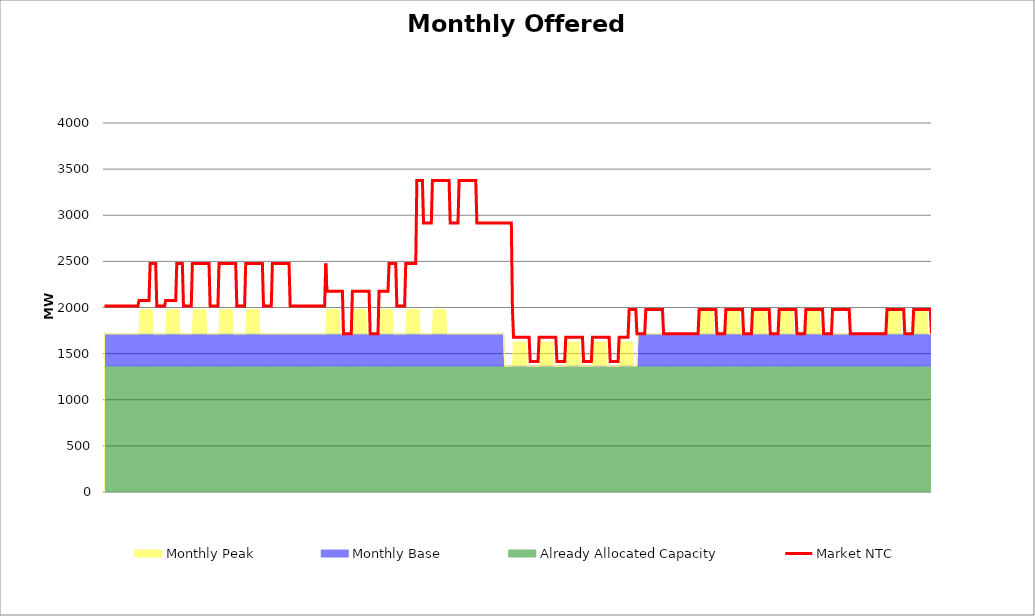
| Category | Market NTC |
|---|---|
| 0 | 2015 |
| 1 | 2015 |
| 2 | 2015 |
| 3 | 2015 |
| 4 | 2015 |
| 5 | 2015 |
| 6 | 2015 |
| 7 | 2015 |
| 8 | 2015 |
| 9 | 2015 |
| 10 | 2015 |
| 11 | 2015 |
| 12 | 2015 |
| 13 | 2015 |
| 14 | 2015 |
| 15 | 2015 |
| 16 | 2015 |
| 17 | 2015 |
| 18 | 2015 |
| 19 | 2015 |
| 20 | 2015 |
| 21 | 2015 |
| 22 | 2015 |
| 23 | 2015 |
| 24 | 2015 |
| 25 | 2015 |
| 26 | 2015 |
| 27 | 2015 |
| 28 | 2015 |
| 29 | 2015 |
| 30 | 2015 |
| 31 | 2077 |
| 32 | 2077 |
| 33 | 2077 |
| 34 | 2077 |
| 35 | 2077 |
| 36 | 2077 |
| 37 | 2077 |
| 38 | 2077 |
| 39 | 2077 |
| 40 | 2077 |
| 41 | 2477 |
| 42 | 2477 |
| 43 | 2477 |
| 44 | 2477 |
| 45 | 2477 |
| 46 | 2477 |
| 47 | 2015 |
| 48 | 2015 |
| 49 | 2015 |
| 50 | 2015 |
| 51 | 2015 |
| 52 | 2015 |
| 53 | 2015 |
| 54 | 2015 |
| 55 | 2077 |
| 56 | 2077 |
| 57 | 2077 |
| 58 | 2077 |
| 59 | 2077 |
| 60 | 2077 |
| 61 | 2077 |
| 62 | 2077 |
| 63 | 2077 |
| 64 | 2077 |
| 65 | 2477 |
| 66 | 2477 |
| 67 | 2477 |
| 68 | 2477 |
| 69 | 2477 |
| 70 | 2477 |
| 71 | 2015 |
| 72 | 2015 |
| 73 | 2015 |
| 74 | 2015 |
| 75 | 2015 |
| 76 | 2015 |
| 77 | 2015 |
| 78 | 2015 |
| 79 | 2477 |
| 80 | 2477 |
| 81 | 2477 |
| 82 | 2477 |
| 83 | 2477 |
| 84 | 2477 |
| 85 | 2477 |
| 86 | 2477 |
| 87 | 2477 |
| 88 | 2477 |
| 89 | 2477 |
| 90 | 2477 |
| 91 | 2477 |
| 92 | 2477 |
| 93 | 2477 |
| 94 | 2477 |
| 95 | 2015 |
| 96 | 2015 |
| 97 | 2015 |
| 98 | 2015 |
| 99 | 2015 |
| 100 | 2015 |
| 101 | 2015 |
| 102 | 2015 |
| 103 | 2477 |
| 104 | 2477 |
| 105 | 2477 |
| 106 | 2477 |
| 107 | 2477 |
| 108 | 2477 |
| 109 | 2477 |
| 110 | 2477 |
| 111 | 2477 |
| 112 | 2477 |
| 113 | 2477 |
| 114 | 2477 |
| 115 | 2477 |
| 116 | 2477 |
| 117 | 2477 |
| 118 | 2477 |
| 119 | 2015 |
| 120 | 2015 |
| 121 | 2015 |
| 122 | 2015 |
| 123 | 2015 |
| 124 | 2015 |
| 125 | 2015 |
| 126 | 2015 |
| 127 | 2477 |
| 128 | 2477 |
| 129 | 2477 |
| 130 | 2477 |
| 131 | 2477 |
| 132 | 2477 |
| 133 | 2477 |
| 134 | 2477 |
| 135 | 2477 |
| 136 | 2477 |
| 137 | 2477 |
| 138 | 2477 |
| 139 | 2477 |
| 140 | 2477 |
| 141 | 2477 |
| 142 | 2477 |
| 143 | 2015 |
| 144 | 2015 |
| 145 | 2015 |
| 146 | 2015 |
| 147 | 2015 |
| 148 | 2015 |
| 149 | 2015 |
| 150 | 2015 |
| 151 | 2477 |
| 152 | 2477 |
| 153 | 2477 |
| 154 | 2477 |
| 155 | 2477 |
| 156 | 2477 |
| 157 | 2477 |
| 158 | 2477 |
| 159 | 2477 |
| 160 | 2477 |
| 161 | 2477 |
| 162 | 2477 |
| 163 | 2477 |
| 164 | 2477 |
| 165 | 2477 |
| 166 | 2477 |
| 167 | 2015 |
| 168 | 2015 |
| 169 | 2015 |
| 170 | 2015 |
| 171 | 2015 |
| 172 | 2015 |
| 173 | 2015 |
| 174 | 2015 |
| 175 | 2015 |
| 176 | 2015 |
| 177 | 2015 |
| 178 | 2015 |
| 179 | 2015 |
| 180 | 2015 |
| 181 | 2015 |
| 182 | 2015 |
| 183 | 2015 |
| 184 | 2015 |
| 185 | 2015 |
| 186 | 2015 |
| 187 | 2015 |
| 188 | 2015 |
| 189 | 2015 |
| 190 | 2015 |
| 191 | 2015 |
| 192 | 2015 |
| 193 | 2015 |
| 194 | 2015 |
| 195 | 2015 |
| 196 | 2015 |
| 197 | 2015 |
| 198 | 2015 |
| 199 | 2477 |
| 200 | 2177 |
| 201 | 2177 |
| 202 | 2177 |
| 203 | 2177 |
| 204 | 2177 |
| 205 | 2177 |
| 206 | 2177 |
| 207 | 2177 |
| 208 | 2177 |
| 209 | 2177 |
| 210 | 2177 |
| 211 | 2177 |
| 212 | 2177 |
| 213 | 2177 |
| 214 | 2177 |
| 215 | 1715 |
| 216 | 1715 |
| 217 | 1715 |
| 218 | 1715 |
| 219 | 1715 |
| 220 | 1715 |
| 221 | 1715 |
| 222 | 1715 |
| 223 | 2177 |
| 224 | 2177 |
| 225 | 2177 |
| 226 | 2177 |
| 227 | 2177 |
| 228 | 2177 |
| 229 | 2177 |
| 230 | 2177 |
| 231 | 2177 |
| 232 | 2177 |
| 233 | 2177 |
| 234 | 2177 |
| 235 | 2177 |
| 236 | 2177 |
| 237 | 2177 |
| 238 | 2177 |
| 239 | 1715 |
| 240 | 1715 |
| 241 | 1715 |
| 242 | 1715 |
| 243 | 1715 |
| 244 | 1715 |
| 245 | 1715 |
| 246 | 1715 |
| 247 | 2177 |
| 248 | 2177 |
| 249 | 2177 |
| 250 | 2177 |
| 251 | 2177 |
| 252 | 2177 |
| 253 | 2177 |
| 254 | 2177 |
| 255 | 2177 |
| 256 | 2477 |
| 257 | 2477 |
| 258 | 2477 |
| 259 | 2477 |
| 260 | 2477 |
| 261 | 2477 |
| 262 | 2477 |
| 263 | 2015 |
| 264 | 2015 |
| 265 | 2015 |
| 266 | 2015 |
| 267 | 2015 |
| 268 | 2015 |
| 269 | 2015 |
| 270 | 2015 |
| 271 | 2477 |
| 272 | 2477 |
| 273 | 2477 |
| 274 | 2477 |
| 275 | 2477 |
| 276 | 2477 |
| 277 | 2477 |
| 278 | 2477 |
| 279 | 2477 |
| 280 | 2477 |
| 281 | 3377 |
| 282 | 3377 |
| 283 | 3377 |
| 284 | 3377 |
| 285 | 3377 |
| 286 | 3377 |
| 287 | 2915 |
| 288 | 2915 |
| 289 | 2915 |
| 290 | 2915 |
| 291 | 2915 |
| 292 | 2915 |
| 293 | 2915 |
| 294 | 2915 |
| 295 | 3377 |
| 296 | 3377 |
| 297 | 3377 |
| 298 | 3377 |
| 299 | 3377 |
| 300 | 3377 |
| 301 | 3377 |
| 302 | 3377 |
| 303 | 3377 |
| 304 | 3377 |
| 305 | 3377 |
| 306 | 3377 |
| 307 | 3377 |
| 308 | 3377 |
| 309 | 3377 |
| 310 | 3377 |
| 311 | 2915 |
| 312 | 2915 |
| 313 | 2915 |
| 314 | 2915 |
| 315 | 2915 |
| 316 | 2915 |
| 317 | 2915 |
| 318 | 2915 |
| 319 | 3377 |
| 320 | 3377 |
| 321 | 3377 |
| 322 | 3377 |
| 323 | 3377 |
| 324 | 3377 |
| 325 | 3377 |
| 326 | 3377 |
| 327 | 3377 |
| 328 | 3377 |
| 329 | 3377 |
| 330 | 3377 |
| 331 | 3377 |
| 332 | 3377 |
| 333 | 3377 |
| 334 | 3377 |
| 335 | 2915 |
| 336 | 2915 |
| 337 | 2915 |
| 338 | 2915 |
| 339 | 2915 |
| 340 | 2915 |
| 341 | 2915 |
| 342 | 2915 |
| 343 | 2915 |
| 344 | 2915 |
| 345 | 2915 |
| 346 | 2915 |
| 347 | 2915 |
| 348 | 2915 |
| 349 | 2915 |
| 350 | 2915 |
| 351 | 2915 |
| 352 | 2915 |
| 353 | 2915 |
| 354 | 2915 |
| 355 | 2915 |
| 356 | 2915 |
| 357 | 2915 |
| 358 | 2915 |
| 359 | 2915 |
| 360 | 2915 |
| 361 | 2915 |
| 362 | 2915 |
| 363 | 2915 |
| 364 | 2915 |
| 365 | 2915 |
| 366 | 2915 |
| 367 | 1977 |
| 368 | 1677 |
| 369 | 1677 |
| 370 | 1677 |
| 371 | 1677 |
| 372 | 1677 |
| 373 | 1677 |
| 374 | 1677 |
| 375 | 1677 |
| 376 | 1677 |
| 377 | 1677 |
| 378 | 1677 |
| 379 | 1677 |
| 380 | 1677 |
| 381 | 1677 |
| 382 | 1677 |
| 383 | 1415 |
| 384 | 1415 |
| 385 | 1415 |
| 386 | 1415 |
| 387 | 1415 |
| 388 | 1415 |
| 389 | 1415 |
| 390 | 1415 |
| 391 | 1677 |
| 392 | 1677 |
| 393 | 1677 |
| 394 | 1677 |
| 395 | 1677 |
| 396 | 1677 |
| 397 | 1677 |
| 398 | 1677 |
| 399 | 1677 |
| 400 | 1677 |
| 401 | 1677 |
| 402 | 1677 |
| 403 | 1677 |
| 404 | 1677 |
| 405 | 1677 |
| 406 | 1677 |
| 407 | 1415 |
| 408 | 1415 |
| 409 | 1415 |
| 410 | 1415 |
| 411 | 1415 |
| 412 | 1415 |
| 413 | 1415 |
| 414 | 1415 |
| 415 | 1677 |
| 416 | 1677 |
| 417 | 1677 |
| 418 | 1677 |
| 419 | 1677 |
| 420 | 1677 |
| 421 | 1677 |
| 422 | 1677 |
| 423 | 1677 |
| 424 | 1677 |
| 425 | 1677 |
| 426 | 1677 |
| 427 | 1677 |
| 428 | 1677 |
| 429 | 1677 |
| 430 | 1677 |
| 431 | 1415 |
| 432 | 1415 |
| 433 | 1415 |
| 434 | 1415 |
| 435 | 1415 |
| 436 | 1415 |
| 437 | 1415 |
| 438 | 1415 |
| 439 | 1677 |
| 440 | 1677 |
| 441 | 1677 |
| 442 | 1677 |
| 443 | 1677 |
| 444 | 1677 |
| 445 | 1677 |
| 446 | 1677 |
| 447 | 1677 |
| 448 | 1677 |
| 449 | 1677 |
| 450 | 1677 |
| 451 | 1677 |
| 452 | 1677 |
| 453 | 1677 |
| 454 | 1677 |
| 455 | 1415 |
| 456 | 1415 |
| 457 | 1415 |
| 458 | 1415 |
| 459 | 1415 |
| 460 | 1415 |
| 461 | 1415 |
| 462 | 1415 |
| 463 | 1677 |
| 464 | 1677 |
| 465 | 1677 |
| 466 | 1677 |
| 467 | 1677 |
| 468 | 1677 |
| 469 | 1677 |
| 470 | 1677 |
| 471 | 1677 |
| 472 | 1977 |
| 473 | 1977 |
| 474 | 1977 |
| 475 | 1977 |
| 476 | 1977 |
| 477 | 1977 |
| 478 | 1977 |
| 479 | 1715 |
| 480 | 1715 |
| 481 | 1715 |
| 482 | 1715 |
| 483 | 1715 |
| 484 | 1715 |
| 485 | 1715 |
| 486 | 1715 |
| 487 | 1977 |
| 488 | 1977 |
| 489 | 1977 |
| 490 | 1977 |
| 491 | 1977 |
| 492 | 1977 |
| 493 | 1977 |
| 494 | 1977 |
| 495 | 1977 |
| 496 | 1977 |
| 497 | 1977 |
| 498 | 1977 |
| 499 | 1977 |
| 500 | 1977 |
| 501 | 1977 |
| 502 | 1977 |
| 503 | 1715 |
| 504 | 1715 |
| 505 | 1715 |
| 506 | 1715 |
| 507 | 1715 |
| 508 | 1715 |
| 509 | 1715 |
| 510 | 1715 |
| 511 | 1715 |
| 512 | 1715 |
| 513 | 1715 |
| 514 | 1715 |
| 515 | 1715 |
| 516 | 1715 |
| 517 | 1715 |
| 518 | 1715 |
| 519 | 1715 |
| 520 | 1715 |
| 521 | 1715 |
| 522 | 1715 |
| 523 | 1715 |
| 524 | 1715 |
| 525 | 1715 |
| 526 | 1715 |
| 527 | 1715 |
| 528 | 1715 |
| 529 | 1715 |
| 530 | 1715 |
| 531 | 1715 |
| 532 | 1715 |
| 533 | 1715 |
| 534 | 1715 |
| 535 | 1977 |
| 536 | 1977 |
| 537 | 1977 |
| 538 | 1977 |
| 539 | 1977 |
| 540 | 1977 |
| 541 | 1977 |
| 542 | 1977 |
| 543 | 1977 |
| 544 | 1977 |
| 545 | 1977 |
| 546 | 1977 |
| 547 | 1977 |
| 548 | 1977 |
| 549 | 1977 |
| 550 | 1977 |
| 551 | 1715 |
| 552 | 1715 |
| 553 | 1715 |
| 554 | 1715 |
| 555 | 1715 |
| 556 | 1715 |
| 557 | 1715 |
| 558 | 1715 |
| 559 | 1977 |
| 560 | 1977 |
| 561 | 1977 |
| 562 | 1977 |
| 563 | 1977 |
| 564 | 1977 |
| 565 | 1977 |
| 566 | 1977 |
| 567 | 1977 |
| 568 | 1977 |
| 569 | 1977 |
| 570 | 1977 |
| 571 | 1977 |
| 572 | 1977 |
| 573 | 1977 |
| 574 | 1977 |
| 575 | 1715 |
| 576 | 1715 |
| 577 | 1715 |
| 578 | 1715 |
| 579 | 1715 |
| 580 | 1715 |
| 581 | 1715 |
| 582 | 1715 |
| 583 | 1977 |
| 584 | 1977 |
| 585 | 1977 |
| 586 | 1977 |
| 587 | 1977 |
| 588 | 1977 |
| 589 | 1977 |
| 590 | 1977 |
| 591 | 1977 |
| 592 | 1977 |
| 593 | 1977 |
| 594 | 1977 |
| 595 | 1977 |
| 596 | 1977 |
| 597 | 1977 |
| 598 | 1977 |
| 599 | 1715 |
| 600 | 1715 |
| 601 | 1715 |
| 602 | 1715 |
| 603 | 1715 |
| 604 | 1715 |
| 605 | 1715 |
| 606 | 1715 |
| 607 | 1977 |
| 608 | 1977 |
| 609 | 1977 |
| 610 | 1977 |
| 611 | 1977 |
| 612 | 1977 |
| 613 | 1977 |
| 614 | 1977 |
| 615 | 1977 |
| 616 | 1977 |
| 617 | 1977 |
| 618 | 1977 |
| 619 | 1977 |
| 620 | 1977 |
| 621 | 1977 |
| 622 | 1977 |
| 623 | 1715 |
| 624 | 1715 |
| 625 | 1715 |
| 626 | 1715 |
| 627 | 1715 |
| 628 | 1715 |
| 629 | 1715 |
| 630 | 1715 |
| 631 | 1977 |
| 632 | 1977 |
| 633 | 1977 |
| 634 | 1977 |
| 635 | 1977 |
| 636 | 1977 |
| 637 | 1977 |
| 638 | 1977 |
| 639 | 1977 |
| 640 | 1977 |
| 641 | 1977 |
| 642 | 1977 |
| 643 | 1977 |
| 644 | 1977 |
| 645 | 1977 |
| 646 | 1977 |
| 647 | 1715 |
| 648 | 1715 |
| 649 | 1715 |
| 650 | 1715 |
| 651 | 1715 |
| 652 | 1715 |
| 653 | 1715 |
| 654 | 1715 |
| 655 | 1977 |
| 656 | 1977 |
| 657 | 1977 |
| 658 | 1977 |
| 659 | 1977 |
| 660 | 1977 |
| 661 | 1977 |
| 662 | 1977 |
| 663 | 1977 |
| 664 | 1977 |
| 665 | 1977 |
| 666 | 1977 |
| 667 | 1977 |
| 668 | 1977 |
| 669 | 1977 |
| 670 | 1977 |
| 671 | 1715 |
| 672 | 1715 |
| 673 | 1715 |
| 674 | 1715 |
| 675 | 1715 |
| 676 | 1715 |
| 677 | 1715 |
| 678 | 1715 |
| 679 | 1715 |
| 680 | 1715 |
| 681 | 1715 |
| 682 | 1715 |
| 683 | 1715 |
| 684 | 1715 |
| 685 | 1715 |
| 686 | 1715 |
| 687 | 1715 |
| 688 | 1715 |
| 689 | 1715 |
| 690 | 1715 |
| 691 | 1715 |
| 692 | 1715 |
| 693 | 1715 |
| 694 | 1715 |
| 695 | 1715 |
| 696 | 1715 |
| 697 | 1715 |
| 698 | 1715 |
| 699 | 1715 |
| 700 | 1715 |
| 701 | 1715 |
| 702 | 1715 |
| 703 | 1715 |
| 704 | 1977 |
| 705 | 1977 |
| 706 | 1977 |
| 707 | 1977 |
| 708 | 1977 |
| 709 | 1977 |
| 710 | 1977 |
| 711 | 1977 |
| 712 | 1977 |
| 713 | 1977 |
| 714 | 1977 |
| 715 | 1977 |
| 716 | 1977 |
| 717 | 1977 |
| 718 | 1977 |
| 719 | 1977 |
| 720 | 1715 |
| 721 | 1715 |
| 722 | 1715 |
| 723 | 1715 |
| 724 | 1715 |
| 725 | 1715 |
| 726 | 1715 |
| 727 | 1715 |
| 728 | 1977 |
| 729 | 1977 |
| 730 | 1977 |
| 731 | 1977 |
| 732 | 1977 |
| 733 | 1977 |
| 734 | 1977 |
| 735 | 1977 |
| 736 | 1977 |
| 737 | 1977 |
| 738 | 1977 |
| 739 | 1977 |
| 740 | 1977 |
| 741 | 1977 |
| 742 | 1977 |
| 743 | 1977 |
| 744 | 1715 |